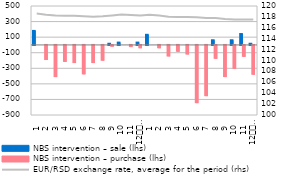
| Category | NBS intervention – sale (lhs) | NBS intervention – purchase (lhs) |
|---|---|---|
| 1 | 180 | 0 |
| 2 | 0 | -180 |
| 3 | 0 | -400 |
| 4 | 0 | -205 |
| 5 | 0 | -220 |
| 6 | 0 | -365 |
| 7 | 0 | -220 |
| 8 | 0 | -190 |
| 9 | 15 | -10 |
| 10 | 30 | 0 |
| 11 | 0 | -15 |
| 12
2018 | 30 | -30 |
| 1 | 130 | 0 |
| 2 | 0 | -30 |
| 3 | 0 | -135 |
| 4 | 0 | -75 |
| 5 | 0 | -110 |
| 6 | 0 | -735 |
| 7 | 0 | -645 |
| 8 | 60 | -165 |
| 9 | 0 | -400 |
| 10 | 60 | -295 |
| 11 | 140 | -140 |
| 12
2019 | 15 | -370 |